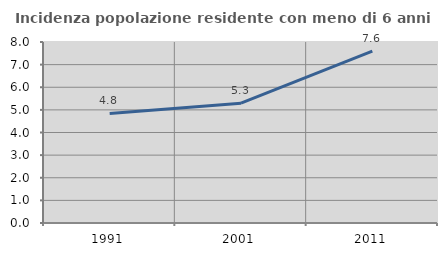
| Category | Incidenza popolazione residente con meno di 6 anni |
|---|---|
| 1991.0 | 4.841 |
| 2001.0 | 5.296 |
| 2011.0 | 7.6 |